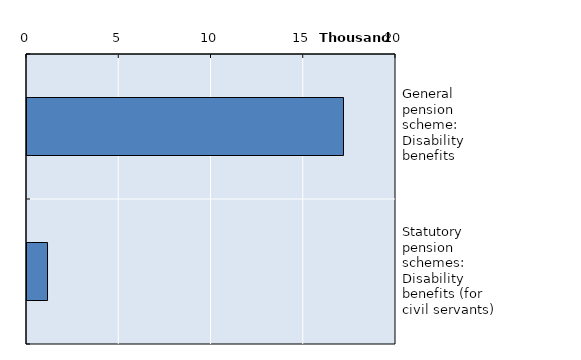
| Category | Series 0 |
|---|---|
| General pension scheme: Disability benefits | 17153 |
| Statutory pension schemes: Disability benefits (for civil servants) | 1112 |